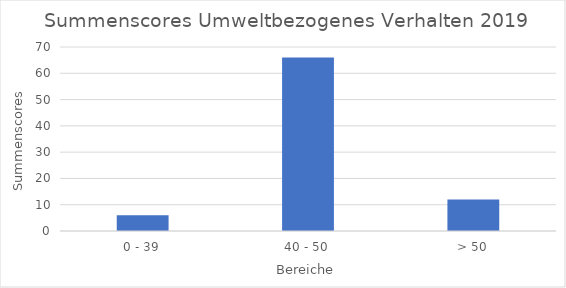
| Category | Series 0 |
|---|---|
| 0 - 39 | 6 |
| 40 - 50 | 66 |
| > 50 | 12 |